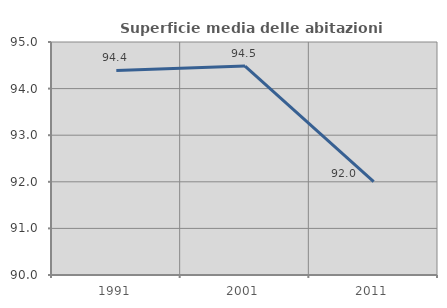
| Category | Superficie media delle abitazioni occupate |
|---|---|
| 1991.0 | 94.389 |
| 2001.0 | 94.483 |
| 2011.0 | 92.006 |